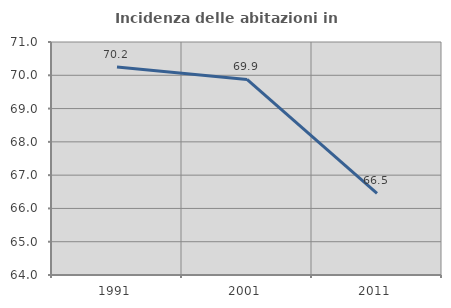
| Category | Incidenza delle abitazioni in proprietà  |
|---|---|
| 1991.0 | 70.25 |
| 2001.0 | 69.876 |
| 2011.0 | 66.453 |